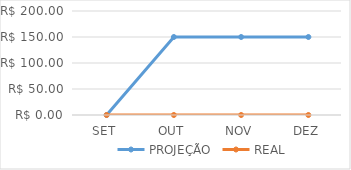
| Category | PROJEÇÃO | REAL |
|---|---|---|
| SET | 0 | 0 |
| OUT | 150 | 0 |
| NOV | 150 | 0 |
| DEZ | 150 | 0 |